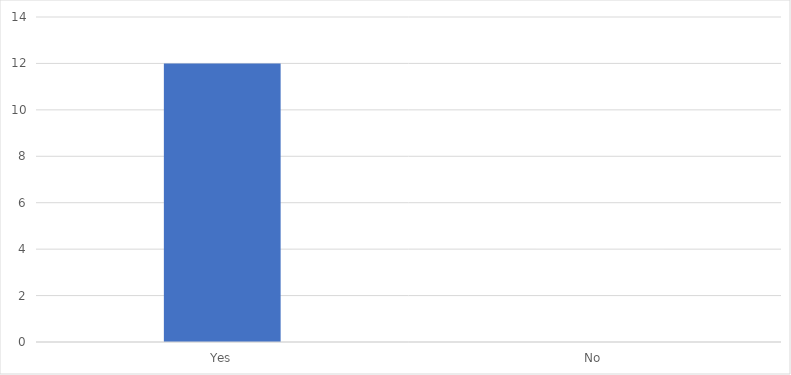
| Category | Number of Responses |
|---|---|
| Yes | 12 |
| No | 0 |